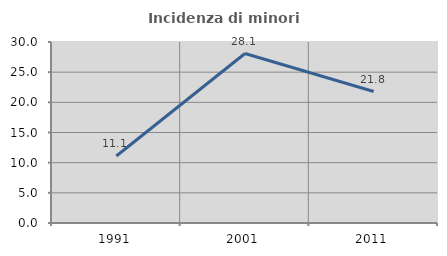
| Category | Incidenza di minori stranieri |
|---|---|
| 1991.0 | 11.111 |
| 2001.0 | 28.09 |
| 2011.0 | 21.788 |